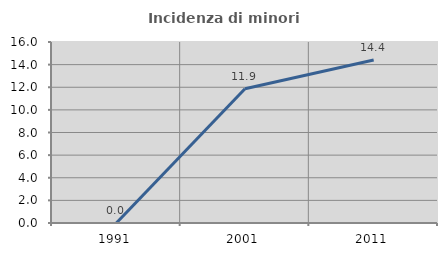
| Category | Incidenza di minori stranieri |
|---|---|
| 1991.0 | 0 |
| 2001.0 | 11.864 |
| 2011.0 | 14.407 |